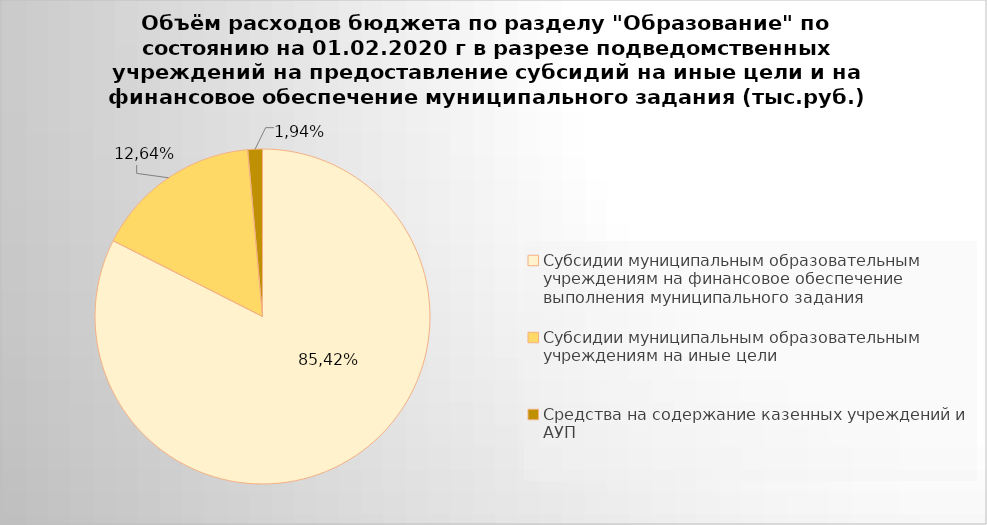
| Category | Series 0 |
|---|---|
| Субсидии муниципальным образовательным учреждениям на финансовое обеспечение выполнения муниципального задания | 4525637.73 |
| Субсидии муниципальным образовательным учреждениям на иные цели | 884557.1 |
| Средства на содержание казенных учреждений и АУП | 77372.8 |